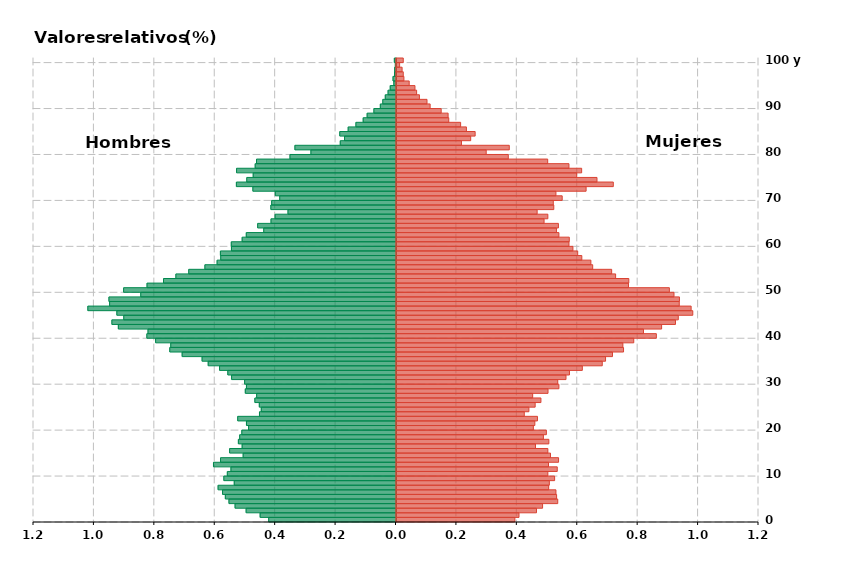
| Category | Hombres | Mujeres |
|---|---|---|
| 0 | -0.421 | 0.392 |
| 1 | -0.45 | 0.406 |
| 2 | -0.496 | 0.463 |
| 3 | -0.533 | 0.484 |
| 4 | -0.553 | 0.534 |
| 5 | -0.565 | 0.53 |
| 6 | -0.574 | 0.528 |
| 7 | -0.589 | 0.504 |
| 8 | -0.535 | 0.506 |
| 9 | -0.57 | 0.523 |
| 10 | -0.558 | 0.501 |
| 11 | -0.546 | 0.532 |
| 12 | -0.604 | 0.503 |
| 13 | -0.581 | 0.537 |
| 14 | -0.506 | 0.51 |
| 15 | -0.551 | 0.501 |
| 16 | -0.509 | 0.46 |
| 17 | -0.522 | 0.504 |
| 18 | -0.517 | 0.486 |
| 19 | -0.51 | 0.496 |
| 20 | -0.488 | 0.453 |
| 21 | -0.495 | 0.458 |
| 22 | -0.524 | 0.467 |
| 23 | -0.452 | 0.423 |
| 24 | -0.446 | 0.438 |
| 25 | -0.452 | 0.459 |
| 26 | -0.467 | 0.478 |
| 27 | -0.461 | 0.451 |
| 28 | -0.499 | 0.502 |
| 29 | -0.495 | 0.538 |
| 30 | -0.501 | 0.534 |
| 31 | -0.544 | 0.561 |
| 32 | -0.557 | 0.573 |
| 33 | -0.584 | 0.615 |
| 34 | -0.622 | 0.681 |
| 35 | -0.642 | 0.692 |
| 36 | -0.708 | 0.715 |
| 37 | -0.749 | 0.752 |
| 38 | -0.746 | 0.749 |
| 39 | -0.796 | 0.785 |
| 40 | -0.825 | 0.86 |
| 41 | -0.821 | 0.818 |
| 42 | -0.919 | 0.878 |
| 43 | -0.94 | 0.923 |
| 44 | -0.901 | 0.933 |
| 45 | -0.924 | 0.981 |
| 46 | -1.02 | 0.975 |
| 47 | -0.948 | 0.936 |
| 48 | -0.95 | 0.937 |
| 49 | -0.845 | 0.919 |
| 50 | -0.902 | 0.903 |
| 51 | -0.824 | 0.768 |
| 52 | -0.77 | 0.769 |
| 53 | -0.729 | 0.725 |
| 54 | -0.686 | 0.712 |
| 55 | -0.633 | 0.649 |
| 56 | -0.592 | 0.643 |
| 57 | -0.58 | 0.613 |
| 58 | -0.581 | 0.6 |
| 59 | -0.545 | 0.584 |
| 60 | -0.545 | 0.571 |
| 61 | -0.509 | 0.572 |
| 62 | -0.496 | 0.538 |
| 63 | -0.438 | 0.529 |
| 64 | -0.458 | 0.536 |
| 65 | -0.414 | 0.488 |
| 66 | -0.4 | 0.501 |
| 67 | -0.357 | 0.466 |
| 68 | -0.414 | 0.521 |
| 69 | -0.412 | 0.519 |
| 70 | -0.385 | 0.549 |
| 71 | -0.4 | 0.528 |
| 72 | -0.474 | 0.628 |
| 73 | -0.528 | 0.718 |
| 74 | -0.494 | 0.664 |
| 75 | -0.473 | 0.597 |
| 76 | -0.528 | 0.613 |
| 77 | -0.466 | 0.571 |
| 78 | -0.462 | 0.5 |
| 79 | -0.351 | 0.37 |
| 80 | -0.282 | 0.297 |
| 81 | -0.335 | 0.373 |
| 82 | -0.184 | 0.215 |
| 83 | -0.17 | 0.246 |
| 84 | -0.186 | 0.26 |
| 85 | -0.158 | 0.231 |
| 86 | -0.133 | 0.212 |
| 87 | -0.109 | 0.173 |
| 88 | -0.096 | 0.171 |
| 89 | -0.073 | 0.148 |
| 90 | -0.052 | 0.111 |
| 91 | -0.044 | 0.101 |
| 92 | -0.035 | 0.076 |
| 93 | -0.026 | 0.067 |
| 94 | -0.019 | 0.061 |
| 95 | -0.007 | 0.042 |
| 96 | -0.01 | 0.025 |
| 97 | -0.005 | 0.022 |
| 98 | -0.004 | 0.019 |
| 99 | -0.002 | 0.01 |
| 100 | -0.005 | 0.022 |